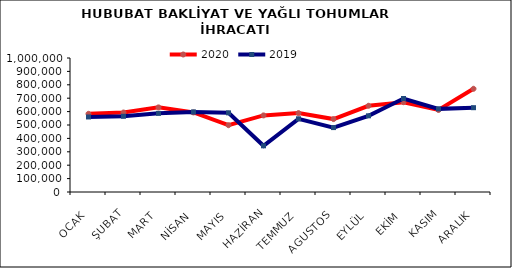
| Category | 2020 | 2019 |
|---|---|---|
| OCAK | 583442.398 | 560029.445 |
| ŞUBAT | 593080.89 | 565214.607 |
| MART | 631434.792 | 586783.555 |
| NİSAN | 593842.897 | 597721.193 |
| MAYIS | 498592.976 | 590704.119 |
| HAZİRAN | 571573.118 | 344700.555 |
| TEMMUZ | 588918.071 | 546255.513 |
| AGUSTOS | 544259.591 | 480724.388 |
| EYLÜL | 643577.662 | 568541.181 |
| EKİM | 670204.636 | 697557.604 |
| KASIM | 612052.901 | 620369.657 |
| ARALIK | 770361.545 | 629238.933 |